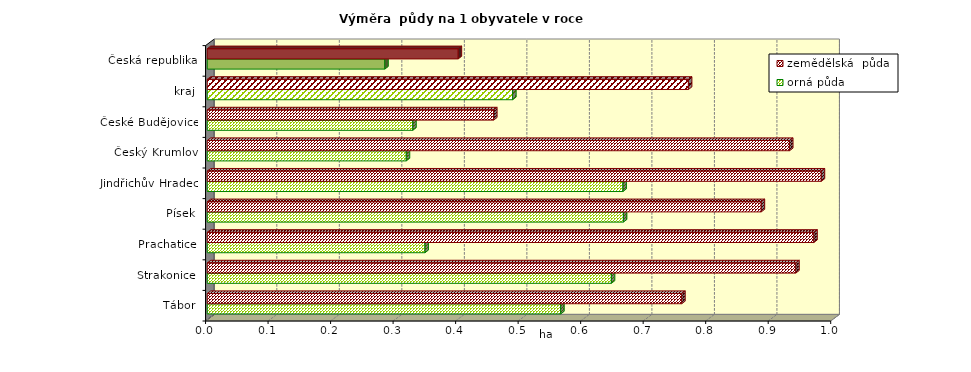
| Category | orná půda | zemědělská  půda |
|---|---|---|
| Tábor | 0.565 | 0.759 |
| Strakonice | 0.646 | 0.941 |
| Prachatice | 0.348 | 0.97 |
| Písek | 0.666 | 0.886 |
| Jindřichův Hradec | 0.665 | 0.982 |
| Český Krumlov | 0.318 | 0.931 |
| České Budějovice | 0.329 | 0.458 |
| kraj | 0.489 | 0.77 |
| Česká republika | 0.284 | 0.401 |